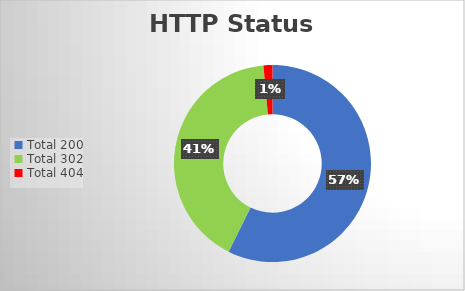
| Category | Series 0 |
|---|---|
| Total 200 | 39 |
| Total 302 | 28 |
| Total 404 | 1 |